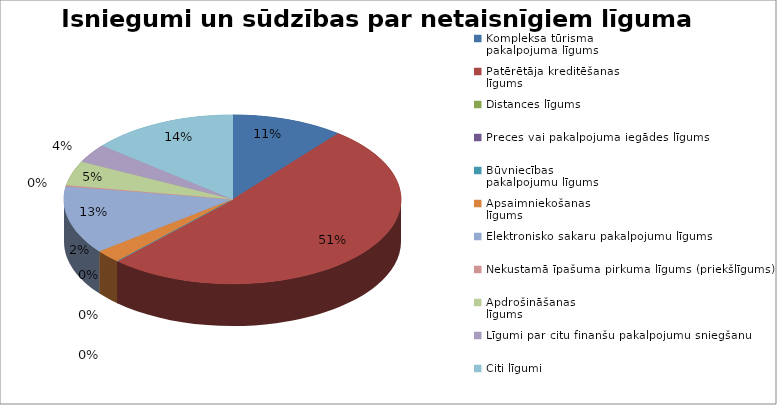
| Category | Series 0 |
|---|---|
| Kompleksa tūrisma
pakalpojuma līgums | 39 |
| Patērētāja kreditēšanas
līgums | 186 |
| Distances līgums | 0 |
| Preces vai pakalpojuma iegādes līgums | 0 |
| Būvniecības 
pakalpojumu līgums
 | 0 |
| Apsaimniekošanas
līgums
 | 9 |
| Elektronisko sakaru pakalpojumu līgums | 47 |
| Nekustamā īpašuma pirkuma līgums (priekšlīgums) | 1 |
| Apdrošināšanas
līgums
 | 17 |
| Līgumi par citu finanšu pakalpojumu sniegšanu | 13 |
| Citi līgumi | 51 |